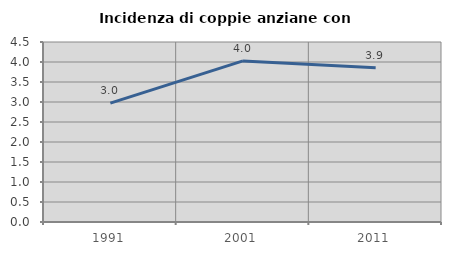
| Category | Incidenza di coppie anziane con figli |
|---|---|
| 1991.0 | 2.973 |
| 2001.0 | 4.027 |
| 2011.0 | 3.856 |